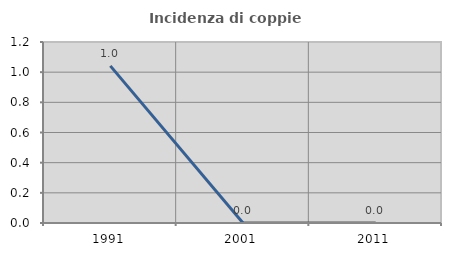
| Category | Incidenza di coppie miste |
|---|---|
| 1991.0 | 1.042 |
| 2001.0 | 0 |
| 2011.0 | 0 |